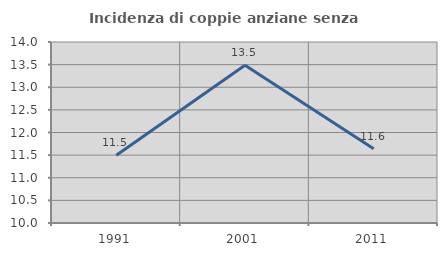
| Category | Incidenza di coppie anziane senza figli  |
|---|---|
| 1991.0 | 11.498 |
| 2001.0 | 13.485 |
| 2011.0 | 11.641 |